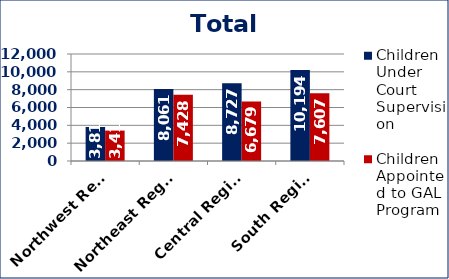
| Category | Children Under Court Supervision  | Children Appointed to GAL Program  |
|---|---|---|
| Northwest Region | 3815 | 3410 |
| Northeast Region | 8061 | 7428 |
| Central Region | 8727 | 6679 |
| South Region | 10194 | 7607 |